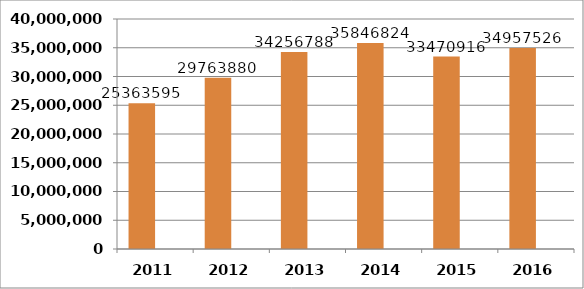
| Category | Series 0 | Series 1 |
|---|---|---|
| 2011.0 | 25363595 |  |
| 2012.0 | 29763880 |  |
| 2013.0 | 34256788 |  |
| 2014.0 | 35846824 |  |
| 2015.0 | 33470916 |  |
| 2016.0 | 34957526 |  |